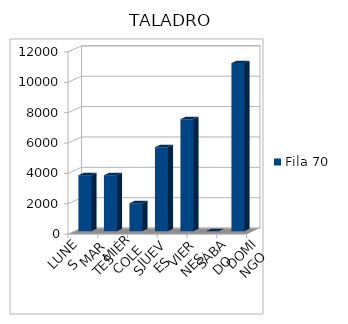
| Category | Fila 70 |
|---|---|
| LUNES | 3690 |
| MARTES | 3690 |
| MIÉRCOLES | 1845 |
| JUEVES | 5535 |
| VIERNES | 7380 |
| SÁBADO | 0 |
| DOMINGO | 11070 |